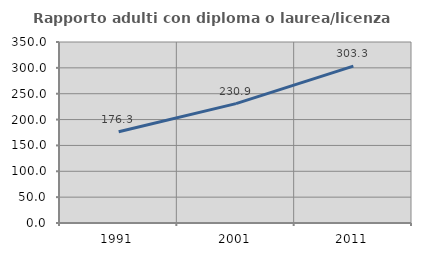
| Category | Rapporto adulti con diploma o laurea/licenza media  |
|---|---|
| 1991.0 | 176.299 |
| 2001.0 | 230.856 |
| 2011.0 | 303.294 |